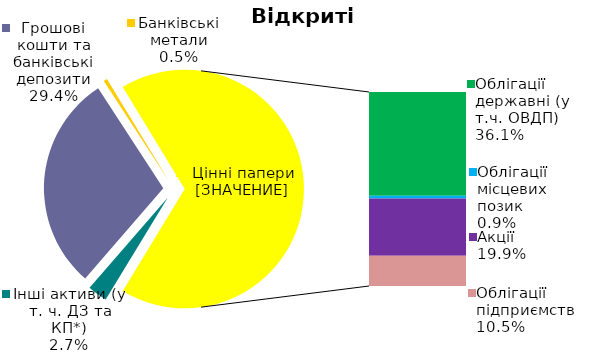
| Category | Series 0 |
|---|---|
| Інші активи (у т. ч. ДЗ та КП*) | 0.027 |
| Грошові кошти та банківські депозити | 0.294 |
| Банківські метали | 0.005 |
| Облігації державні (у т.ч. ОВДП) | 0.361 |
| Облігації місцевих позик | 0.009 |
| Акцiї | 0.199 |
| Облігації підприємств | 0.105 |